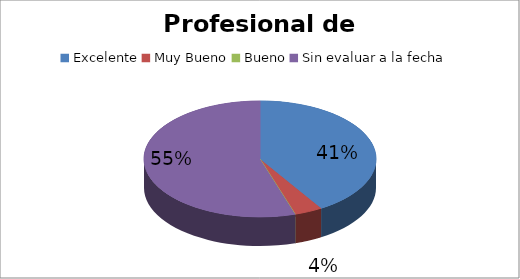
| Category | Cantidad |
|---|---|
| Excelente | 21 |
| Muy Bueno | 2 |
| Bueno | 0 |
| Sin evaluar a la fecha | 28 |